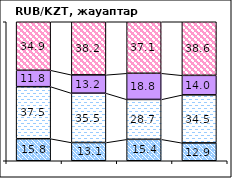
| Category | повысится | не изменится | снизится | не знаю |
|---|---|---|---|---|
| 0 | 15.84 | 37.45 | 11.8 | 34.91 |
| 1 | 13.12 | 35.5 | 13.18 | 38.21 |
| 2 | 15.42 | 28.69 | 18.83 | 37.06 |
| 3 | 12.87 | 34.54 | 14.04 | 38.56 |